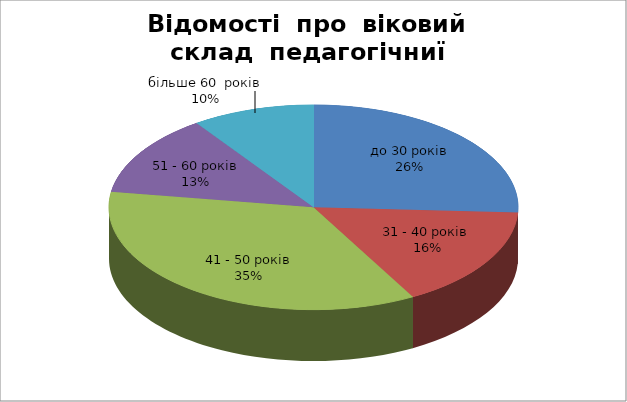
| Category | Series 0 |
|---|---|
| до 30 років | 8 |
| 31 - 40 років  | 5 |
| 41 - 50 років | 11 |
| 51 - 60 років | 4 |
| більше 60  років | 3 |